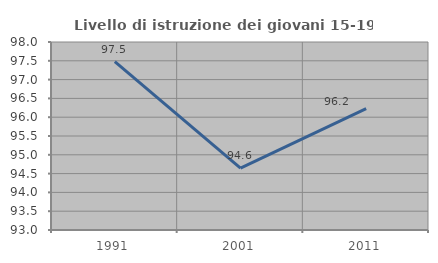
| Category | Livello di istruzione dei giovani 15-19 anni |
|---|---|
| 1991.0 | 97.479 |
| 2001.0 | 94.643 |
| 2011.0 | 96.226 |